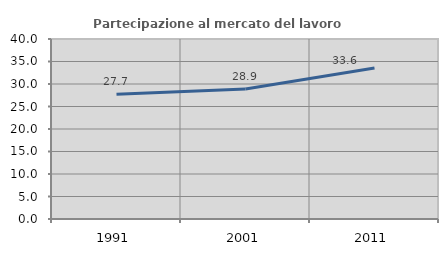
| Category | Partecipazione al mercato del lavoro  femminile |
|---|---|
| 1991.0 | 27.697 |
| 2001.0 | 28.882 |
| 2011.0 | 33.562 |